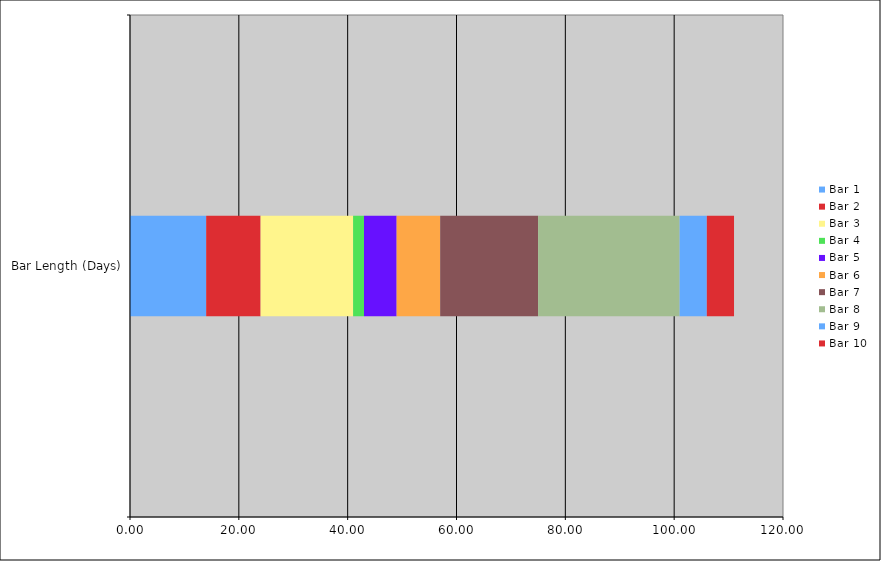
| Category | Bar 1 | Bar 2 | Bar 3 | Bar 4 | Bar 5 | Bar 6 | Bar 7 | Bar 8 | Bar 9 | Bar 10 |
|---|---|---|---|---|---|---|---|---|---|---|
| Bar Length (Days) | 14 | 10 | 17 | 2 | 6 | 8 | 18 | 26 | 5 | 5 |